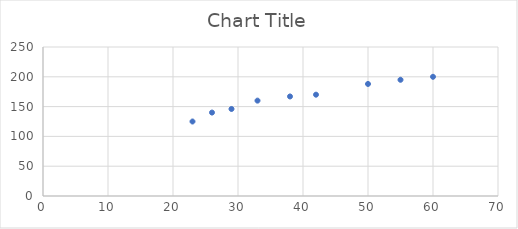
| Category | Series 0 |
|---|---|
| 23.0 | 125 |
| 26.0 | 140 |
| 29.0 | 146 |
| 33.0 | 160 |
| 38.0 | 167 |
| 42.0 | 170 |
| 50.0 | 188 |
| 55.0 | 195 |
| 60.0 | 200 |